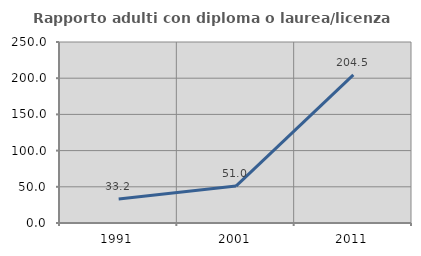
| Category | Rapporto adulti con diploma o laurea/licenza media  |
|---|---|
| 1991.0 | 33.161 |
| 2001.0 | 50.987 |
| 2011.0 | 204.478 |